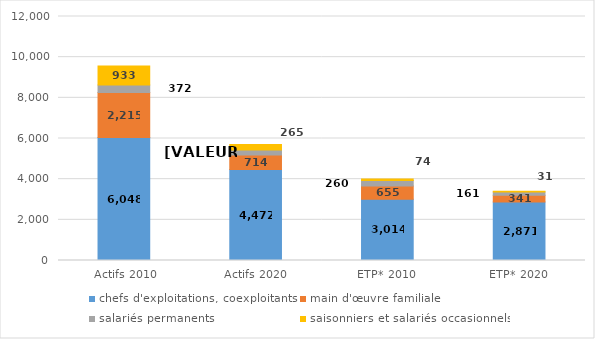
| Category | chefs d'exploitations, coexploitants | main d'œuvre familiale | salariés permanents | saisonniers et salariés occasionnels |
|---|---|---|---|---|
|  Actifs 2010 | 6048 | 2215 | 372 | 933 |
| Actifs 2020 | 4472 | 714 | 252 | 265 |
| ETP* 2010 | 3013.625 | 655.25 | 259.5 | 73.833 |
| ETP* 2020 | 2871.25 | 341.375 | 161.375 | 31.312 |